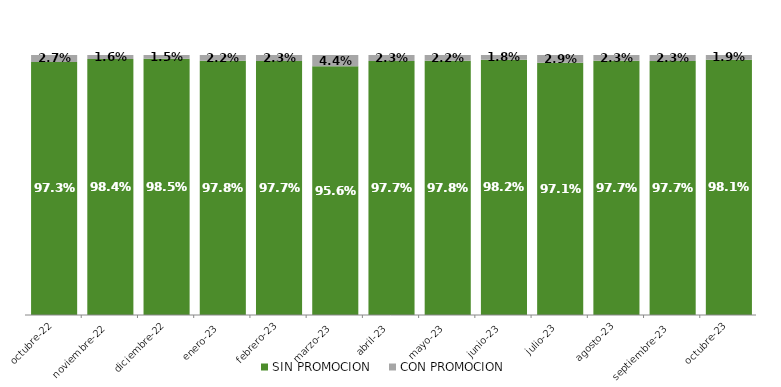
| Category | SIN PROMOCION   | CON PROMOCION   |
|---|---|---|
| 2022-10-01 | 0.973 | 0.027 |
| 2022-11-01 | 0.984 | 0.016 |
| 2022-12-01 | 0.985 | 0.015 |
| 2023-01-01 | 0.978 | 0.022 |
| 2023-02-01 | 0.977 | 0.023 |
| 2023-03-01 | 0.956 | 0.044 |
| 2023-04-01 | 0.977 | 0.023 |
| 2023-05-01 | 0.978 | 0.022 |
| 2023-06-01 | 0.982 | 0.018 |
| 2023-07-01 | 0.971 | 0.029 |
| 2023-08-01 | 0.977 | 0.023 |
| 2023-09-01 | 0.977 | 0.023 |
| 2023-10-01 | 0.981 | 0.019 |